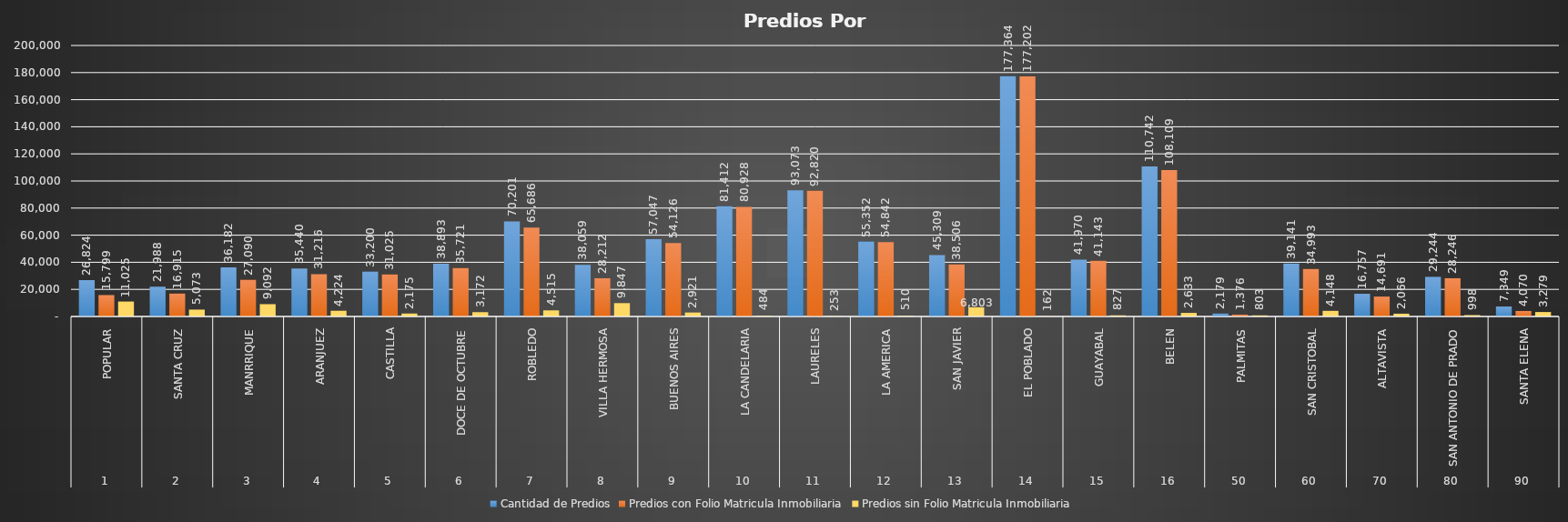
| Category | Cantidad de Predios | Predios con Folio Matricula Inmobiliaria | Predios sin Folio Matricula Inmobiliaria |
|---|---|---|---|
| 0 | 26824 | 15799 | 11025 |
| 1 | 21988 | 16915 | 5073 |
| 2 | 36182 | 27090 | 9092 |
| 3 | 35440 | 31216 | 4224 |
| 4 | 33200 | 31025 | 2175 |
| 5 | 38893 | 35721 | 3172 |
| 6 | 70201 | 65686 | 4515 |
| 7 | 38059 | 28212 | 9847 |
| 8 | 57047 | 54126 | 2921 |
| 9 | 81412 | 80928 | 484 |
| 10 | 93073 | 92820 | 253 |
| 11 | 55352 | 54842 | 510 |
| 12 | 45309 | 38506 | 6803 |
| 13 | 177364 | 177202 | 162 |
| 14 | 41970 | 41143 | 827 |
| 15 | 110742 | 108109 | 2633 |
| 16 | 2179 | 1376 | 803 |
| 17 | 39141 | 34993 | 4148 |
| 18 | 16757 | 14691 | 2066 |
| 19 | 29244 | 28246 | 998 |
| 20 | 7349 | 4070 | 3279 |